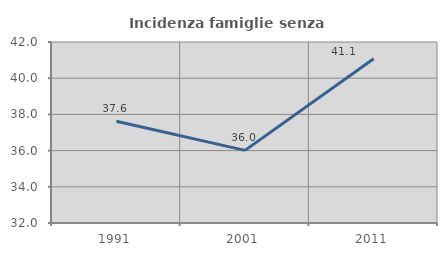
| Category | Incidenza famiglie senza nuclei |
|---|---|
| 1991.0 | 37.621 |
| 2001.0 | 36.013 |
| 2011.0 | 41.071 |